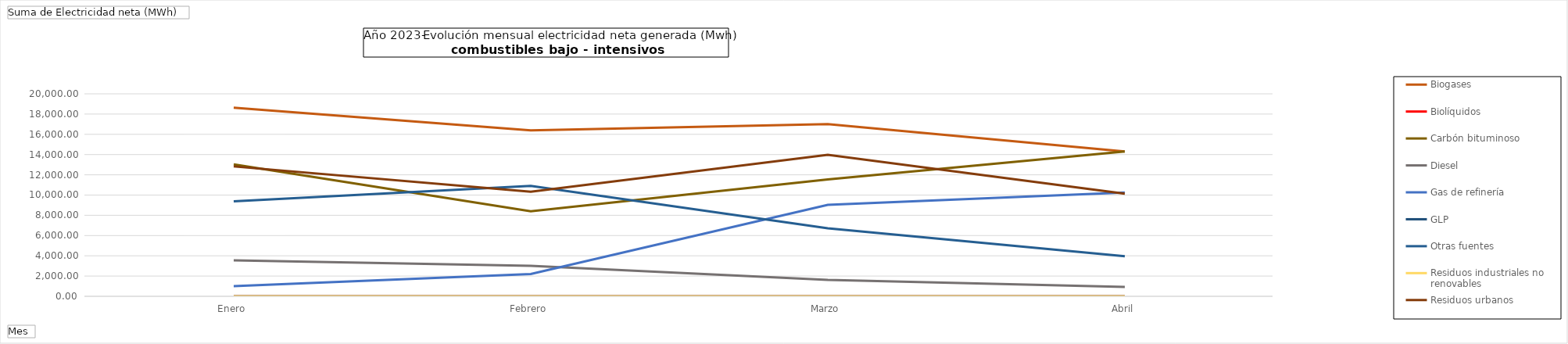
| Category | Biogases | Biolíquidos | Carbón bituminoso | Diesel | Gas de refinería | GLP | Otras fuentes | Residuos industriales no renovables | Residuos urbanos |
|---|---|---|---|---|---|---|---|---|---|
| Enero | 18634.94 | 0 | 13028.06 | 3561.16 | 1001.47 | 9.35 | 9382.51 | 0 | 12828.45 |
| Febrero | 16397.35 | 0 | 8395.17 | 3003.51 | 2205 | 0 | 10915.52 | 0 | 10325.86 |
| Marzo | 17007.89 | 0 | 11542.86 | 1628.15 | 9025.75 | 0 | 6713.09 | 0 | 13966.76 |
| Abril | 14298.54 | 0 | 14301.12 | 935.41 | 10258.51 | 0 | 3954.36 | 0 | 10139.41 |